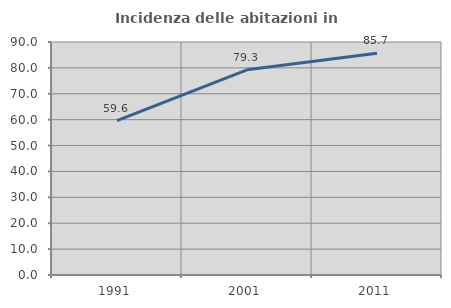
| Category | Incidenza delle abitazioni in proprietà  |
|---|---|
| 1991.0 | 59.591 |
| 2001.0 | 79.259 |
| 2011.0 | 85.662 |